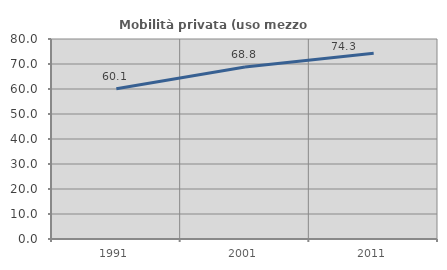
| Category | Mobilità privata (uso mezzo privato) |
|---|---|
| 1991.0 | 60.075 |
| 2001.0 | 68.8 |
| 2011.0 | 74.277 |